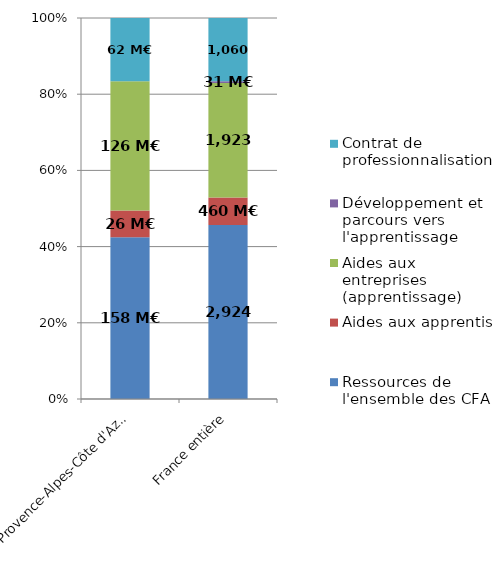
| Category | Ressources de l'ensemble des CFA | Aides aux apprentis | Aides aux entreprises (apprentissage) | Développement et parcours vers l'apprentissage | Contrat de professionnalisation |
|---|---|---|---|---|---|
| Provence-Alpes-Côte d'Azur | 158.058 | 26.263 | 126.311 | 0 | 61.918 |
| France entière | 2924.219 | 459.796 | 1923.184 | 31.421 | 1060.48 |